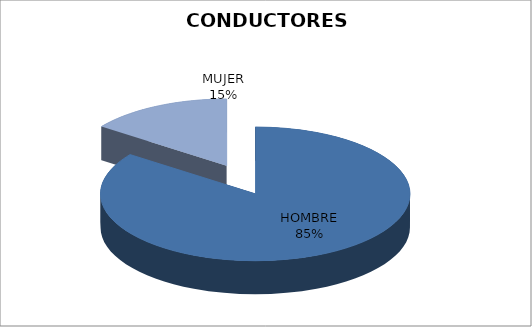
| Category | E.E. |
|---|---|
| HOMBRE | 17 |
| MUJER | 3 |